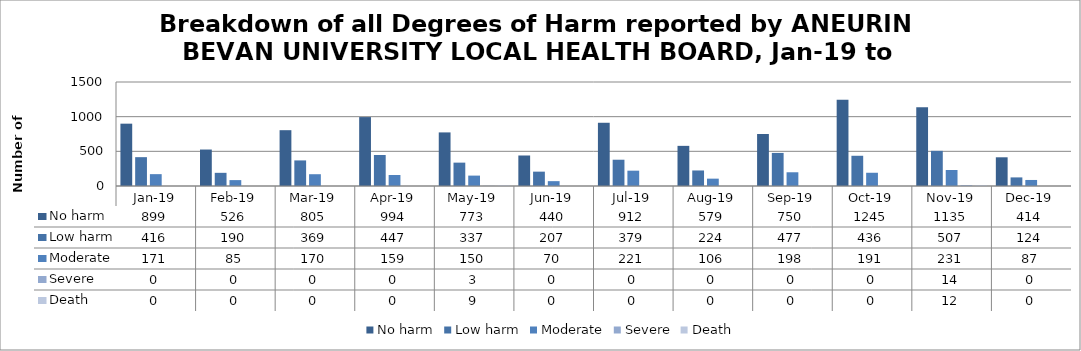
| Category | No harm | Low harm | Moderate | Severe | Death |
|---|---|---|---|---|---|
| Jan-19 | 899 | 416 | 171 | 0 | 0 |
| Feb-19 | 526 | 190 | 85 | 0 | 0 |
| Mar-19 | 805 | 369 | 170 | 0 | 0 |
| Apr-19 | 994 | 447 | 159 | 0 | 0 |
| May-19 | 773 | 337 | 150 | 3 | 9 |
| Jun-19 | 440 | 207 | 70 | 0 | 0 |
| Jul-19 | 912 | 379 | 221 | 0 | 0 |
| Aug-19 | 579 | 224 | 106 | 0 | 0 |
| Sep-19 | 750 | 477 | 198 | 0 | 0 |
| Oct-19 | 1245 | 436 | 191 | 0 | 0 |
| Nov-19 | 1135 | 507 | 231 | 14 | 12 |
| Dec-19 | 414 | 124 | 87 | 0 | 0 |